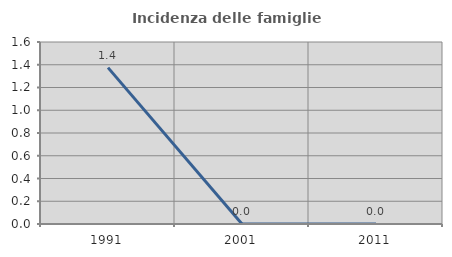
| Category | Incidenza delle famiglie numerose |
|---|---|
| 1991.0 | 1.375 |
| 2001.0 | 0 |
| 2011.0 | 0 |